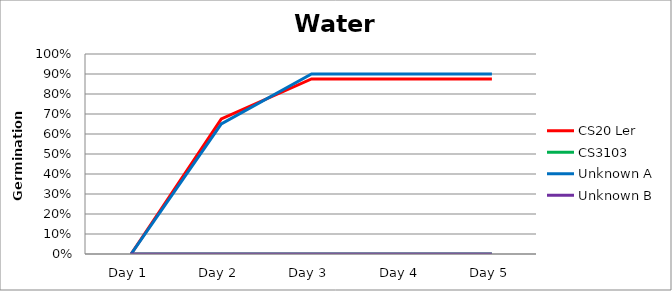
| Category | CS20 Ler | CS3103  | Unknown A | Unknown B |
|---|---|---|---|---|
| Day 1 | 0 | 0 | 0 | 0 |
| Day 2 | 0.675 | 0 | 0.65 | 0 |
| Day 3 | 0.875 | 0 | 0.9 | 0 |
| Day 4 | 0.875 | 0 | 0.9 | 0 |
| Day 5 | 0.875 | 0 | 0.9 | 0 |